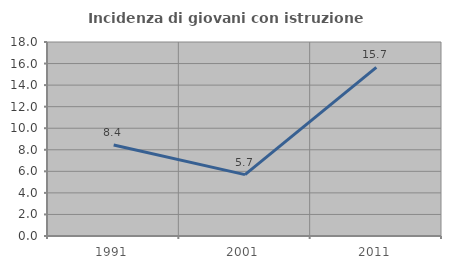
| Category | Incidenza di giovani con istruzione universitaria |
|---|---|
| 1991.0 | 8.442 |
| 2001.0 | 5.696 |
| 2011.0 | 15.652 |